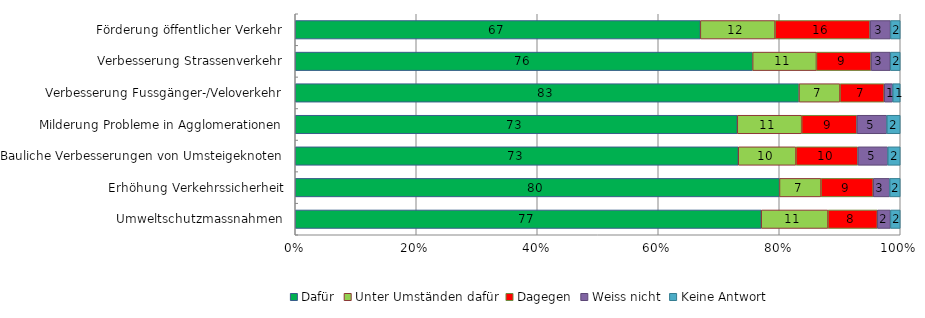
| Category | Dafür | Unter Umständen dafür | Dagegen | Weiss nicht | Keine Antwort |
|---|---|---|---|---|---|
| Förderung öffentlicher Verkehr | 66.959 | 12.354 | 15.697 | 3.378 | 1.612 |
| Verbesserung Strassenverkehr | 75.602 | 10.54 | 9.033 | 3.185 | 1.64 |
| Verbesserung Fussgänger-/Veloverkehr | 83.26 | 6.779 | 7.308 | 1.415 | 1.239 |
| Milderung Probleme in Agglomerationen | 73.064 | 10.64 | 9.131 | 4.944 | 2.22 |
| Bauliche Verbesserungen von Umsteigeknoten | 73.225 | 9.531 | 10.242 | 4.942 | 2.06 |
| Erhöhung Verkehrssicherheit | 80.039 | 6.86 | 8.632 | 2.722 | 1.747 |
| Umweltschutzmassnahmen | 77.025 | 11.023 | 8.17 | 2.163 | 1.619 |